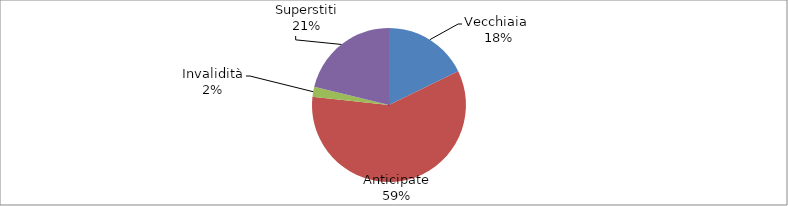
| Category | Series 0 |
|---|---|
| Vecchiaia  | 26017 |
| Anticipate | 86256 |
| Invalidità | 3052 |
| Superstiti | 31018 |